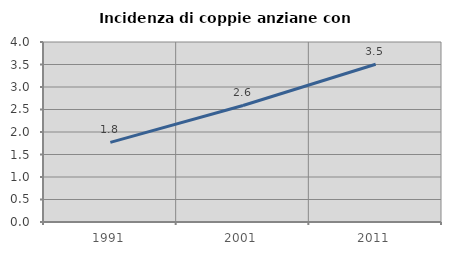
| Category | Incidenza di coppie anziane con figli |
|---|---|
| 1991.0 | 1.768 |
| 2001.0 | 2.589 |
| 2011.0 | 3.506 |